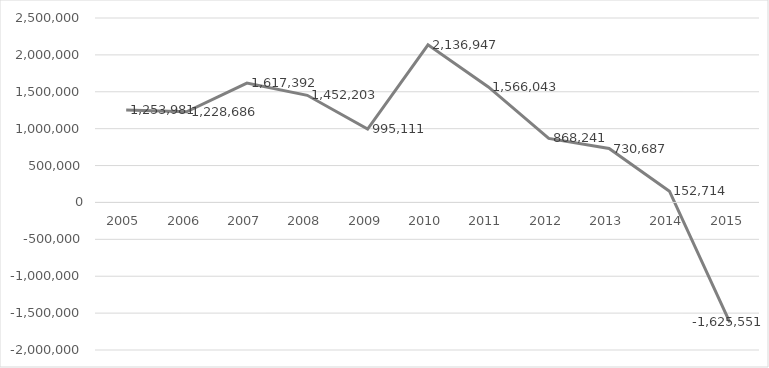
| Category | Series 0 |
|---|---|
| 2005.0 | 1253981 |
| 2006.0 | 1228686 |
| 2007.0 | 1617392 |
| 2008.0 | 1452203 |
| 2009.0 | 995111 |
| 2010.0 | 2136947 |
| 2011.0 | 1566043 |
| 2012.0 | 868241 |
| 2013.0 | 730687 |
| 2014.0 | 152714 |
| 2015.0 | -1625551 |